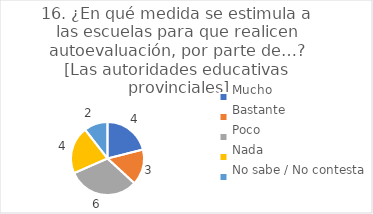
| Category | 16. ¿En qué medida se estimula a las escuelas para que realicen autoevaluación, por parte de…?
[Las autoridades educativas provinciales] |
|---|---|
| Mucho  | 0.211 |
| Bastante  | 0.158 |
| Poco  | 0.316 |
| Nada  | 0.211 |
| No sabe / No contesta | 0.105 |